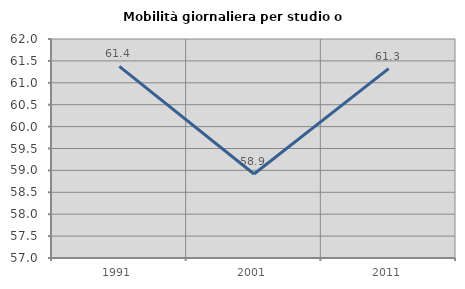
| Category | Mobilità giornaliera per studio o lavoro |
|---|---|
| 1991.0 | 61.375 |
| 2001.0 | 58.918 |
| 2011.0 | 61.323 |